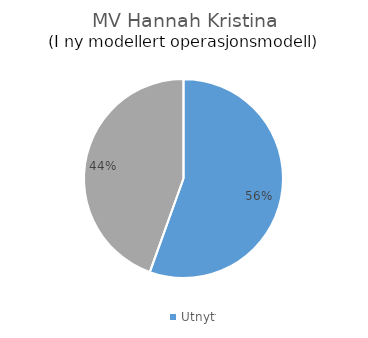
| Category | Series 0 |
|---|---|
| Utnyttet kapasitet | 0.555 |